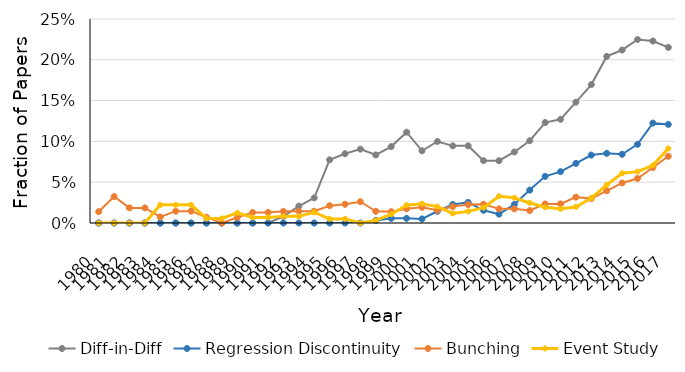
| Category | Diff-in-Diff | Regression Discontinuity | Bunching | Event Study |
|---|---|---|---|---|
| 1980.0 | 0 | 0 | 0.014 | 0 |
| 1981.0 | 0 | 0 | 0.032 | 0 |
| 1982.0 | 0 | 0 | 0.019 | 0 |
| 1983.0 | 0 | 0 | 0.019 | 0 |
| 1984.0 | 0 | 0 | 0.007 | 0.022 |
| 1985.0 | 0 | 0 | 0.014 | 0.022 |
| 1986.0 | 0 | 0 | 0.014 | 0.022 |
| 1987.0 | 0 | 0 | 0.007 | 0.006 |
| 1988.0 | 0 | 0 | 0 | 0.006 |
| 1989.0 | 0 | 0 | 0.007 | 0.012 |
| 1990.0 | 0 | 0 | 0.013 | 0.007 |
| 1991.0 | 0 | 0 | 0.013 | 0.007 |
| 1992.0 | 0.008 | 0 | 0.014 | 0.008 |
| 1993.0 | 0.021 | 0 | 0.014 | 0.008 |
| 1994.0 | 0.031 | 0 | 0.014 | 0.013 |
| 1995.0 | 0.077 | 0 | 0.021 | 0.005 |
| 1996.0 | 0.085 | 0 | 0.023 | 0.005 |
| 1997.0 | 0.091 | 0 | 0.026 | 0 |
| 1998.0 | 0.083 | 0.003 | 0.014 | 0.003 |
| 1999.0 | 0.094 | 0.006 | 0.014 | 0.011 |
| 2000.0 | 0.111 | 0.006 | 0.017 | 0.022 |
| 2001.0 | 0.089 | 0.005 | 0.019 | 0.024 |
| 2002.0 | 0.1 | 0.014 | 0.016 | 0.02 |
| 2003.0 | 0.095 | 0.023 | 0.02 | 0.012 |
| 2004.0 | 0.095 | 0.025 | 0.023 | 0.014 |
| 2005.0 | 0.076 | 0.016 | 0.023 | 0.019 |
| 2006.0 | 0.076 | 0.011 | 0.017 | 0.033 |
| 2007.0 | 0.087 | 0.023 | 0.017 | 0.031 |
| 2008.0 | 0.101 | 0.04 | 0.015 | 0.025 |
| 2009.0 | 0.123 | 0.057 | 0.023 | 0.019 |
| 2010.0 | 0.127 | 0.063 | 0.023 | 0.017 |
| 2011.0 | 0.148 | 0.073 | 0.032 | 0.02 |
| 2012.0 | 0.17 | 0.083 | 0.03 | 0.03 |
| 2013.0 | 0.204 | 0.085 | 0.039 | 0.047 |
| 2014.0 | 0.212 | 0.084 | 0.049 | 0.061 |
| 2015.0 | 0.225 | 0.096 | 0.055 | 0.063 |
| 2016.0 | 0.223 | 0.122 | 0.068 | 0.071 |
| 2017.0 | 0.215 | 0.121 | 0.082 | 0.091 |